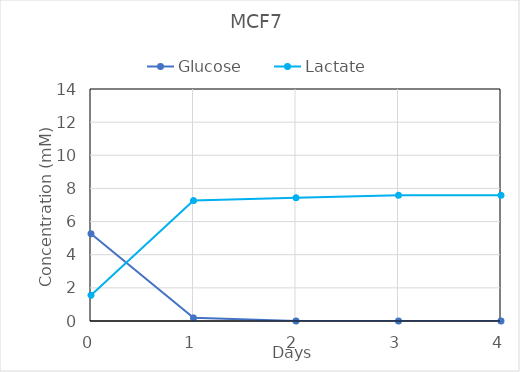
| Category | Glucose | Lactate |
|---|---|---|
| 0.0 | 5.26 | 1.55 |
| 1.0 | 0.19 | 7.27 |
| 2.0 | 0 | 7.44 |
| 3.0 | 0 | 7.59 |
| 4.0 | 0 | 7.59 |